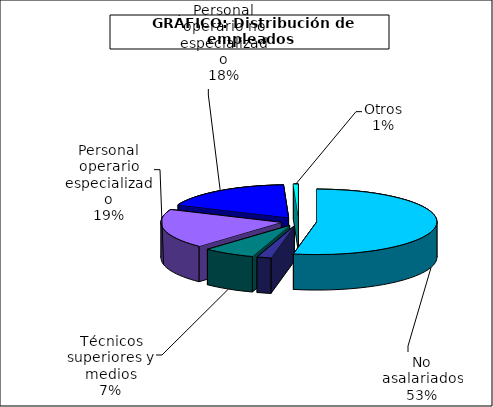
| Category | Series 0 |
|---|---|
| No asalariados | 5445.696 |
| Administrativos | 194.899 |
| Técnicos superiores y medios | 715.81 |
| Personal operario especializado | 1991.97 |
| Personal operario no especializado | 1836.191 |
| Otros | 68.886 |